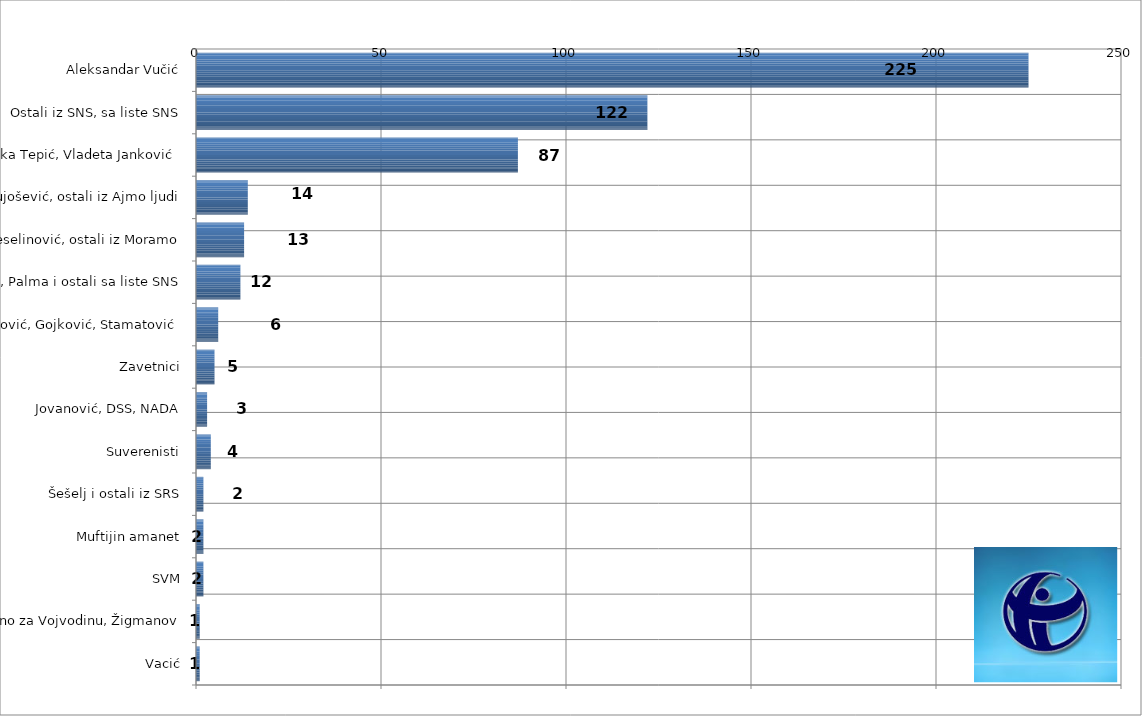
| Category | Series 0 |
|---|---|
| Aleksandar Vučić | 225 |
| Ostali iz SNS, sa liste SNS | 122 |
| Dragan Đilas, Zdravko Ponoš, Marinika Tepić, Vladeta Janković | 87 |
| Tadić, Vujošević, ostali iz Ajmo ljudi | 14 |
| Biljana Stojković, Veselinović, ostali iz Moramo | 13 |
| Dačić, Palma i ostali sa liste SNS | 12 |
| Dveri, POKS, Obradović, Gojković, Stamatović | 6 |
| Zavetnici | 5 |
| Jovanović, DSS, NADA | 3 |
| Suverenisti | 4 |
| Šešelj i ostali iz SRS | 2 |
| Muftijin amanet | 2 |
| SVM | 2 |
| Zajedno za Vojvodinu, Žigmanov | 1 |
| Vacić | 1 |